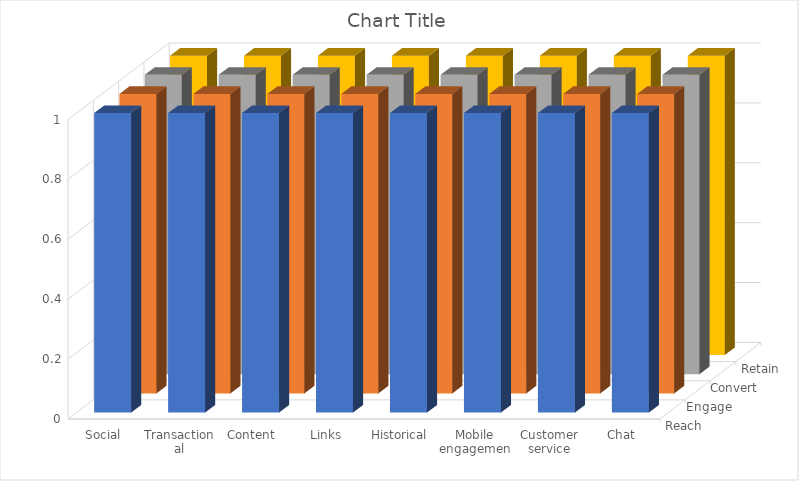
| Category | Reach | Engage | Convert | Retain |
|---|---|---|---|---|
| Social | 1 | 1 | 1 | 1 |
| Transactional | 1 | 1 | 1 | 1 |
| Content | 1 | 1 | 1 | 1 |
| Links | 1 | 1 | 1 | 1 |
| Historical | 1 | 1 | 1 | 1 |
| Mobile engagement  | 1 | 1 | 1 | 1 |
| Customer service | 1 | 1 | 1 | 1 |
| Chat | 1 | 1 | 1 | 1 |